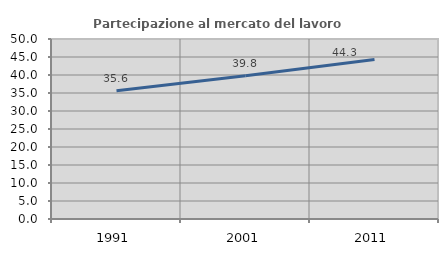
| Category | Partecipazione al mercato del lavoro  femminile |
|---|---|
| 1991.0 | 35.644 |
| 2001.0 | 39.811 |
| 2011.0 | 44.334 |